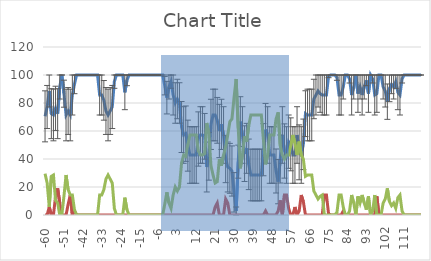
| Category | Wake | REM | NREM |
|---|---|---|---|
| -60.0 | 70.471 | 0 | 29.529 |
| -59.0 | 77.143 | 0 | 22.857 |
| -58.0 | 88.571 | 5.714 | 5.714 |
| -57.0 | 72.386 | 0 | 27.614 |
| -56.0 | 71.429 | 0 | 28.571 |
| -55.0 | 76.186 | 13.329 | 10.486 |
| -54.0 | 72.386 | 19.043 | 8.571 |
| -53.0 | 91.429 | 8.571 | 0 |
| -52.0 | 100 | 0 | 0 |
| -51.0 | 86.657 | 0 | 13.343 |
| -50.0 | 71.429 | 0 | 28.571 |
| -49.0 | 74.286 | 7.614 | 18.1 |
| -48.0 | 71.429 | 14.286 | 14.286 |
| -47.0 | 85.714 | 0 | 14.286 |
| -46.0 | 93.329 | 2.857 | 3.814 |
| -45.0 | 100 | 0 | 0 |
| -44.0 | 100 | 0 | 0 |
| -43.0 | 100 | 0 | 0 |
| -42.0 | 100 | 0 | 0 |
| -41.0 | 100 | 0 | 0 |
| -40.0 | 100 | 0 | 0 |
| -39.0 | 100 | 0 | 0 |
| -38.0 | 100 | 0 | 0 |
| -37.0 | 100 | 0 | 0 |
| -36.0 | 100 | 0 | 0 |
| -35.0 | 100 | 0 | 0 |
| -34.0 | 85.714 | 0 | 14.286 |
| -33.0 | 85.714 | 0 | 14.286 |
| -32.0 | 81.9 | 0 | 18.1 |
| -31.0 | 74.286 | 0 | 25.714 |
| -30.0 | 71.429 | 0 | 28.571 |
| -29.0 | 74.286 | 0 | 25.714 |
| -28.0 | 77.143 | 0 | 22.857 |
| -27.0 | 95.243 | 0 | 4.757 |
| -26.0 | 100 | 0 | 0 |
| -25.0 | 100 | 0 | 0 |
| -24.0 | 100 | 0 | 0 |
| -23.0 | 100 | 0 | 0 |
| -22.0 | 87.614 | 0 | 12.386 |
| -21.0 | 96.186 | 0 | 3.814 |
| -20.0 | 100 | 0 | 0 |
| -19.0 | 100 | 0 | 0 |
| -18.0 | 100 | 0 | 0 |
| -17.0 | 100 | 0 | 0 |
| -16.0 | 100 | 0 | 0 |
| -15.0 | 100 | 0 | 0 |
| -14.0 | 100 | 0 | 0 |
| -13.0 | 100 | 0 | 0 |
| -12.0 | 100 | 0 | 0 |
| -11.0 | 100 | 0 | 0 |
| -10.0 | 100 | 0 | 0 |
| -9.0 | 100 | 0 | 0 |
| -8.0 | 100 | 0 | 0 |
| -7.0 | 100 | 0 | 0 |
| -6.0 | 100 | 0 | 0 |
| -5.0 | 100 | 0 | 0 |
| -4.0 | 100 | 0 | 0 |
| -3.0 | 92.371 | 0 | 7.629 |
| -2.0 | 83.814 | 0 | 16.186 |
| -1.0 | 91.429 | 0 | 8.571 |
| 0.0 | 95.243 | 0 | 4.757 |
| 1.0 | 85.714 | 0 | 14.286 |
| 2.0 | 80 | 0 | 20 |
| 3.0 | 82.857 | 0 | 17.143 |
| 4.0 | 80 | 0 | 20 |
| 5.0 | 62.857 | 0 | 37.143 |
| 6.0 | 57.143 | 0 | 42.857 |
| 7.0 | 58.1 | 0 | 41.9 |
| 8.0 | 49.529 | 0 | 50.471 |
| 9.0 | 42.857 | 0 | 57.143 |
| 10.0 | 42.857 | 0 | 57.143 |
| 11.0 | 42.857 | 0 | 57.143 |
| 12.0 | 42.857 | 0 | 57.143 |
| 13.0 | 54.286 | 0 | 45.714 |
| 14.0 | 57.143 | 0 | 42.857 |
| 15.0 | 57.143 | 0 | 42.857 |
| 16.0 | 56.2 | 0 | 43.8 |
| 17.0 | 34.286 | 0 | 65.714 |
| 18.0 | 41.9 | 0 | 58.1 |
| 19.0 | 64.757 | 0 | 35.243 |
| 20.0 | 71.429 | 0 | 28.571 |
| 21.0 | 71.429 | 5.714 | 22.857 |
| 22.0 | 67.614 | 8.571 | 23.814 |
| 23.0 | 60 | 0 | 40 |
| 24.0 | 64.757 | 0 | 35.243 |
| 25.0 | 57.143 | 0 | 42.857 |
| 26.0 | 40 | 11.429 | 48.571 |
| 27.0 | 34.286 | 8.571 | 57.143 |
| 28.0 | 33.329 | 0 | 66.671 |
| 29.0 | 31.429 | 0 | 68.571 |
| 30.0 | 16.186 | 0 | 83.814 |
| 31.0 | 2.857 | 0 | 97.143 |
| 32.0 | 38.1 | 0 | 61.9 |
| 33.0 | 66.671 | 0 | 33.329 |
| 34.0 | 57.143 | 0 | 42.857 |
| 35.0 | 43.814 | 0 | 56.186 |
| 36.0 | 47.614 | 0 | 52.386 |
| 37.0 | 36.186 | 0 | 63.814 |
| 38.0 | 28.571 | 0 | 71.429 |
| 39.0 | 28.571 | 0 | 71.429 |
| 40.0 | 28.571 | 0 | 71.429 |
| 41.0 | 28.571 | 0 | 71.429 |
| 42.0 | 28.571 | 0 | 71.429 |
| 43.0 | 28.571 | 0 | 71.429 |
| 44.0 | 46.657 | 0 | 53.343 |
| 45.0 | 60.957 | 2.857 | 36.186 |
| 46.0 | 57.143 | 0 | 42.857 |
| 47.0 | 42.857 | 0 | 57.143 |
| 48.0 | 42.857 | 0 | 57.143 |
| 49.0 | 42.857 | 0 | 57.143 |
| 50.0 | 31.429 | 0 | 68.571 |
| 51.0 | 23.814 | 2.857 | 73.329 |
| 52.0 | 40 | 10.471 | 49.529 |
| 53.0 | 57.143 | 0 | 42.857 |
| 54.0 | 45.714 | 14.286 | 40 |
| 55.0 | 42.857 | 14.286 | 42.857 |
| 56.0 | 52.386 | 4.757 | 42.857 |
| 57.0 | 50.471 | 0 | 49.529 |
| 58.0 | 42.857 | 0 | 57.143 |
| 59.0 | 42.857 | 5.714 | 51.429 |
| 60.0 | 57.143 | 0 | 42.857 |
| 61.0 | 44.757 | 2.857 | 52.386 |
| 62.0 | 42.857 | 14.286 | 42.857 |
| 63.0 | 50.471 | 9.529 | 40 |
| 64.0 | 72.386 | 0 | 27.614 |
| 65.0 | 71.429 | 0 | 28.571 |
| 66.0 | 71.429 | 0 | 28.571 |
| 67.0 | 71.429 | 0 | 28.571 |
| 68.0 | 82.857 | 0 | 17.143 |
| 69.0 | 85.714 | 0 | 14.286 |
| 70.0 | 88.571 | 0 | 11.429 |
| 71.0 | 86.671 | 0 | 13.329 |
| 72.0 | 85.714 | 0 | 14.286 |
| 73.0 | 85.714 | 14.286 | 0 |
| 74.0 | 85.714 | 14.286 | 0 |
| 75.0 | 99.043 | 0.957 | 0 |
| 76.0 | 100 | 0 | 0 |
| 77.0 | 100 | 0 | 0 |
| 78.0 | 100 | 0 | 0 |
| 79.0 | 98.1 | 0 | 1.9 |
| 80.0 | 85.714 | 0 | 14.286 |
| 81.0 | 85.714 | 0 | 14.286 |
| 82.0 | 91.429 | 2.857 | 5.714 |
| 83.0 | 100 | 0 | 0 |
| 84.0 | 100 | 0 | 0 |
| 85.0 | 97.143 | 0 | 2.857 |
| 86.0 | 85.714 | 0 | 14.286 |
| 87.0 | 91.429 | 0 | 8.571 |
| 88.0 | 100 | 0 | 0 |
| 89.0 | 86.671 | 0 | 13.329 |
| 90.0 | 91.429 | 0 | 8.571 |
| 91.0 | 85.714 | 0 | 14.286 |
| 92.0 | 91.429 | 0 | 8.571 |
| 93.0 | 96.186 | 0 | 3.814 |
| 94.0 | 86.671 | 0 | 13.329 |
| 95.0 | 100 | 0 | 0 |
| 96.0 | 97.143 | 0 | 2.857 |
| 97.0 | 85.714 | 0 | 14.286 |
| 98.0 | 86.671 | 13.329 | 0 |
| 99.0 | 100 | 0 | 0 |
| 100.0 | 100 | 0 | 0 |
| 101.0 | 91.429 | 0 | 8.571 |
| 102.0 | 88.571 | 0 | 11.429 |
| 103.0 | 80.957 | 0 | 19.043 |
| 104.0 | 90.471 | 0 | 9.529 |
| 105.0 | 93.329 | 0 | 6.671 |
| 106.0 | 91.429 | 0 | 8.571 |
| 107.0 | 95.243 | 0 | 4.757 |
| 108.0 | 87.614 | 0 | 12.386 |
| 109.0 | 85.714 | 0 | 14.286 |
| 110.0 | 97.143 | 0 | 2.857 |
| 111.0 | 100 | 0 | 0 |
| 112.0 | 100 | 0 | 0 |
| 113.0 | 100 | 0 | 0 |
| 114.0 | 100 | 0 | 0 |
| 115.0 | 100 | 0 | 0 |
| 116.0 | 100 | 0 | 0 |
| 117.0 | 100 | 0 | 0 |
| 118.0 | 100 | 0 | 0 |
| 119.0 | 100 | 0 | 0 |